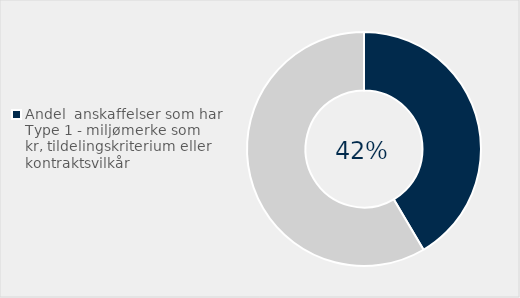
| Category | Series 0 |
|---|---|
| Andel  anskaffelser som har Type 1 - miljømerke som kr, tildelingskriterium eller kontraktsvilkår | 0.415 |
| Ikke brukt Type 1 - miljømerke | 0.585 |